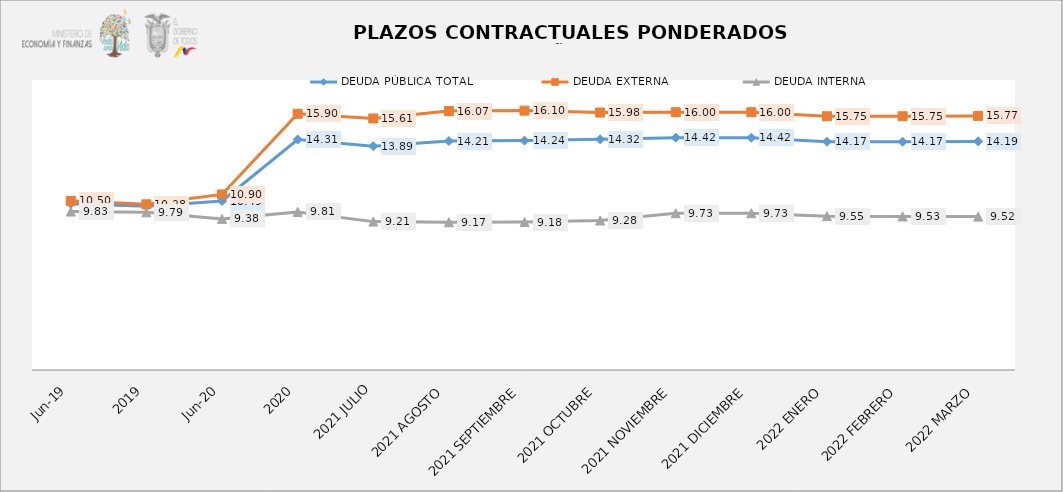
| Category | DEUDA PÚBLICA TOTAL | DEUDA EXTERNA  | DEUDA INTERNA |
|---|---|---|---|
| jun-19 | 10.321 | 10.498 | 9.835 |
| 2019 | 10.156 | 10.284 | 9.786 |
| jun-20 | 10.488 | 10.898 | 9.379 |
| 2020 | 14.309 | 15.905 | 9.812 |
| 2021 JULIO | 13.89 | 15.614 | 9.21 |
| 2021 AGOSTO | 14.21 | 16.07 | 9.17 |
| 2021 SEPTIEMBRE | 14.24 | 16.1 | 9.18 |
| 2021 OCTUBRE | 14.32 | 15.98 | 9.28 |
| 2021 NOVIEMBRE | 14.42 | 16 | 9.73 |
| 2021 DICIEMBRE | 14.42 | 16 | 9.73 |
| 2022 ENERO | 14.17 | 15.75 | 9.55 |
| 2022 FEBRERO | 14.17 | 15.75 | 9.53 |
| 2022 MARZO | 14.19 | 15.77 | 9.52 |